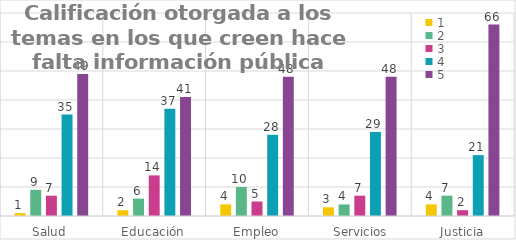
| Category | 1 | 2 | 3 | 4 | 5 |
|---|---|---|---|---|---|
| Salud | 1 | 9 | 7 | 35 | 49 |
| Educación | 2 | 6 | 14 | 37 | 41 |
| Empleo | 4 | 10 | 5 | 28 | 48 |
| Servicios públicos | 3 | 4 | 7 | 29 | 48 |
| Justicia | 4 | 7 | 2 | 21 | 66 |